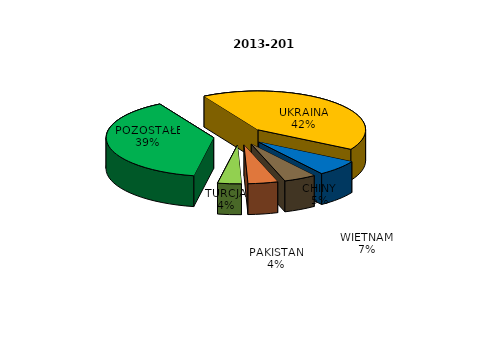
| Category | Series 0 |
|---|---|
| UKRAINA | 3858 |
| WIETNAM | 617 |
| CHINY | 450 |
| PAKISTAN | 414 |
| TURCJA | 328 |
| POZOSTAŁE | 3578 |